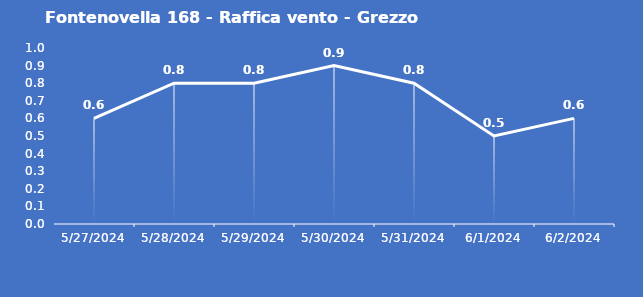
| Category | Fontenovella 168 - Raffica vento - Grezzo (m/s) |
|---|---|
| 5/27/24 | 0.6 |
| 5/28/24 | 0.8 |
| 5/29/24 | 0.8 |
| 5/30/24 | 0.9 |
| 5/31/24 | 0.8 |
| 6/1/24 | 0.5 |
| 6/2/24 | 0.6 |